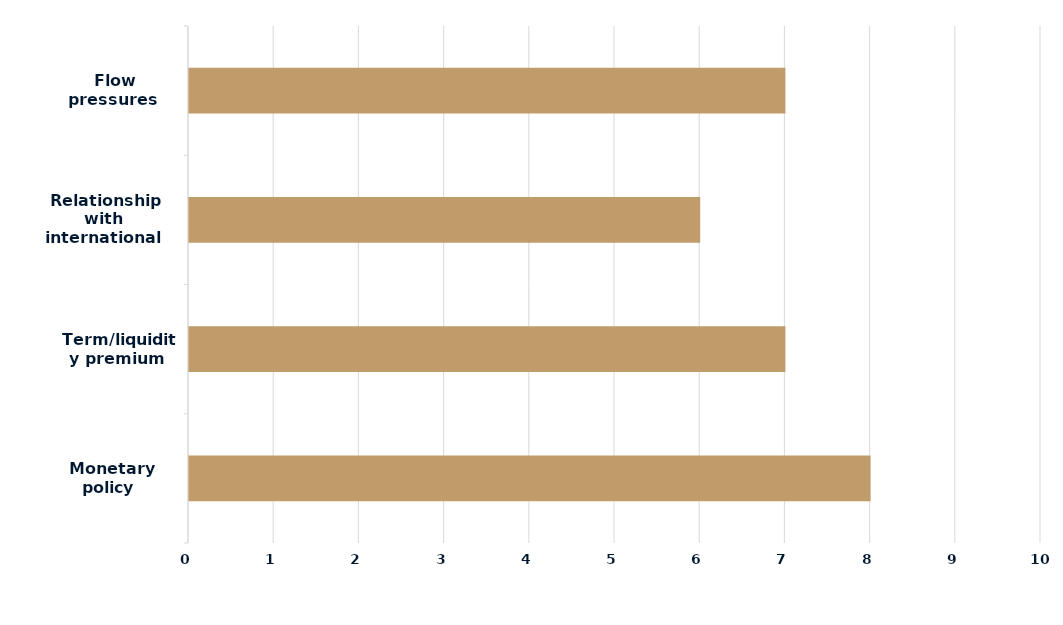
| Category | Series 0 |
|---|---|
|  Monetary policy | 8 |
|  Term/liquidity premium | 7 |
|  Relationship with international curves | 6 |
|  Flow pressures | 7 |